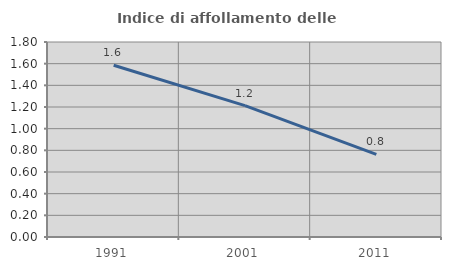
| Category | Indice di affollamento delle abitazioni  |
|---|---|
| 1991.0 | 1.586 |
| 2001.0 | 1.213 |
| 2011.0 | 0.763 |